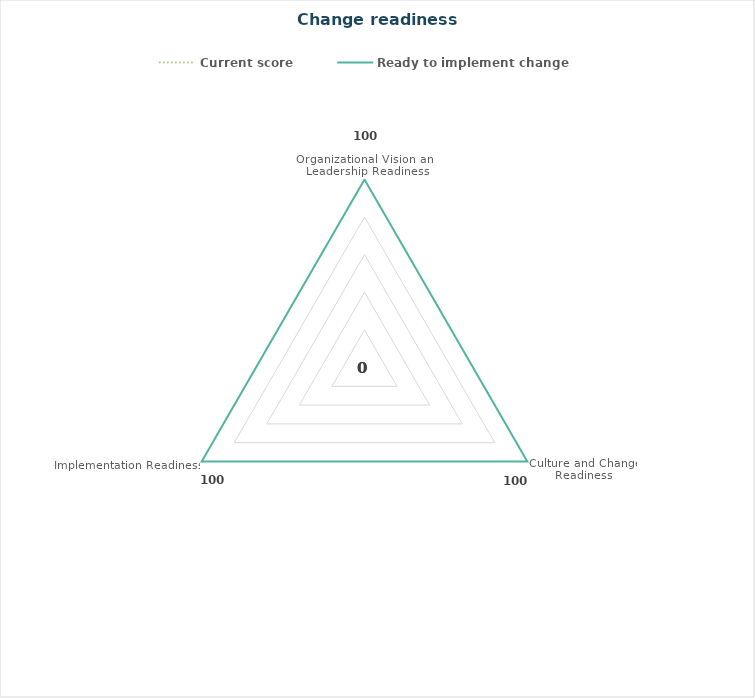
| Category | Current score | Ready to implement change |
|---|---|---|
| Organizational Vision and Leadership Readiness | 0 | 100 |
| Culture and Change Readiness | 0 | 100 |
| Implementation Readiness | 0 | 100 |